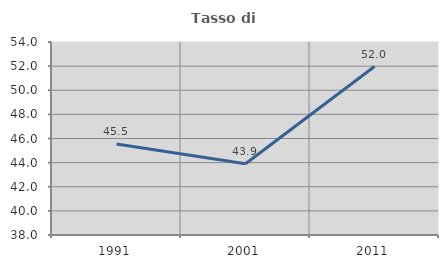
| Category | Tasso di occupazione   |
|---|---|
| 1991.0 | 45.54 |
| 2001.0 | 43.911 |
| 2011.0 | 51.965 |